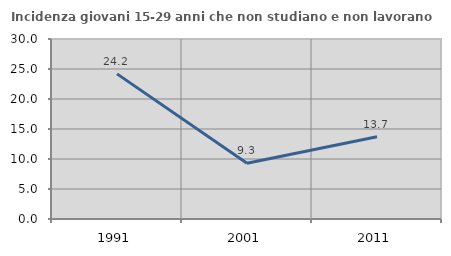
| Category | Incidenza giovani 15-29 anni che non studiano e non lavorano  |
|---|---|
| 1991.0 | 24.189 |
| 2001.0 | 9.284 |
| 2011.0 | 13.695 |